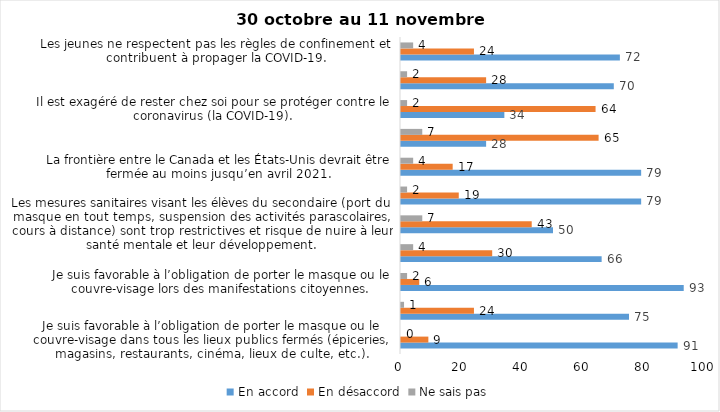
| Category | En accord | En désaccord | Ne sais pas |
|---|---|---|---|
| Je suis favorable à l’obligation de porter le masque ou le couvre-visage dans tous les lieux publics fermés (épiceries, magasins, restaurants, cinéma, lieux de culte, etc.). | 91 | 9 | 0 |
| C’est une bonne chose que les policiers puissent donner facilement des contraventions aux gens qui ne respectent pas les mesures pour prévenir le coronavirus (la COVID-19). | 75 | 24 | 1 |
| Je suis favorable à l’obligation de porter le masque ou le couvre-visage lors des manifestations citoyennes. | 93 | 6 | 2 |
| C’est une bonne chose d’arrêter les activités sportives de groupe (ex. hockey, soccer, yoga, etc.) et de fermer les centres d’entraînement (gyms) dans les zones rouges. | 66 | 30 | 4 |
| Les mesures sanitaires visant les élèves du secondaire (port du masque en tout temps, suspension des activités parascolaires, cours à distance) sont trop restrictives et risque de nuire à leur santé mentale et leur développement. | 50 | 43 | 7 |
| Je suis favorable à l’obligation de porter le masque ou le couvre-visage en tout temps pour les élèves au secondaire. | 79 | 19 | 2 |
| La frontière entre le Canada et les États-Unis devrait être fermée au moins jusqu’en avril 2021. | 79 | 17 | 4 |
| Le gouvernement et les médias exagèrent par rapport au coronavirus (la COVID-19). | 28 | 65 | 7 |
| Il est exagéré de rester chez soi pour se protéger contre le coronavirus (la COVID-19). | 34 | 64 | 2 |
| J’ai peur que le système de santé soit débordé par les cas de COVID-19 suite au «déconfinement». | 70 | 28 | 2 |
| Les jeunes ne respectent pas les règles de confinement et contribuent à propager la COVID-19. | 72 | 24 | 4 |